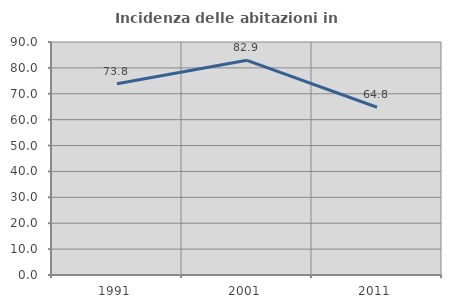
| Category | Incidenza delle abitazioni in proprietà  |
|---|---|
| 1991.0 | 73.837 |
| 2001.0 | 82.913 |
| 2011.0 | 64.807 |